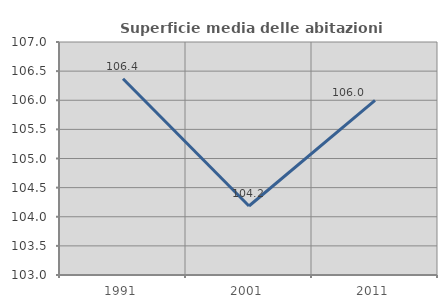
| Category | Superficie media delle abitazioni occupate |
|---|---|
| 1991.0 | 106.369 |
| 2001.0 | 104.185 |
| 2011.0 | 105.998 |